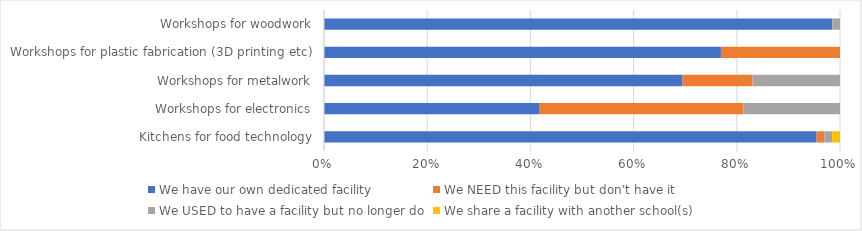
| Category | We have our own dedicated facility | We NEED this facility but don't have it | We USED to have a facility but no longer do | We share a facility with another school(s) |
|---|---|---|---|---|
| Kitchens for food technology | 0.955 | 0.015 | 0.015 | 0.015 |
| Workshops for electronics | 0.417 | 0.396 | 0.188 | 0 |
| Workshops for metalwork | 0.695 | 0.136 | 0.169 | 0 |
| Workshops for plastic fabrication (3D printing etc) | 0.769 | 0.231 | 0 | 0 |
| Workshops for woodwork | 0.985 | 0 | 0.015 | 0 |